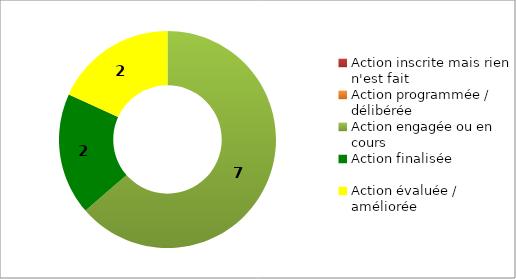
| Category | Series 0 |
|---|---|
| Action inscrite mais rien n'est fait | 0 |
| Action programmée / délibérée | 0 |
| Action engagée ou en cours | 7 |
| Action finalisée | 2 |
| Action évaluée / améliorée | 2 |